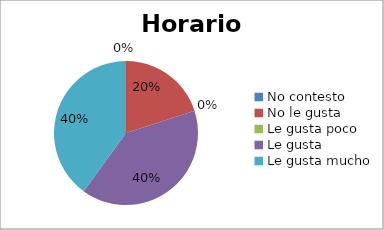
| Category | Series 0 |
|---|---|
| No contesto | 0 |
| No le gusta | 1 |
| Le gusta poco | 0 |
| Le gusta | 2 |
| Le gusta mucho | 2 |